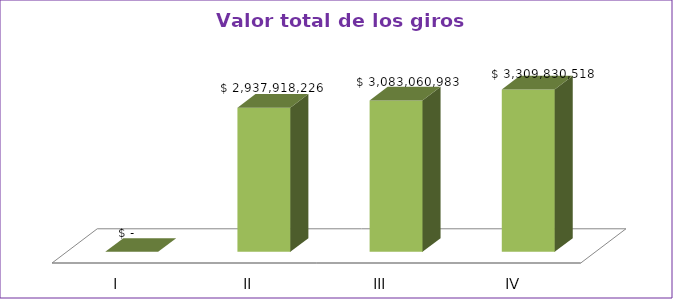
| Category | Series 0 |
|---|---|
| I | 0 |
| II | 2937918226 |
| III | 3083060983 |
| IV | 3309830518 |